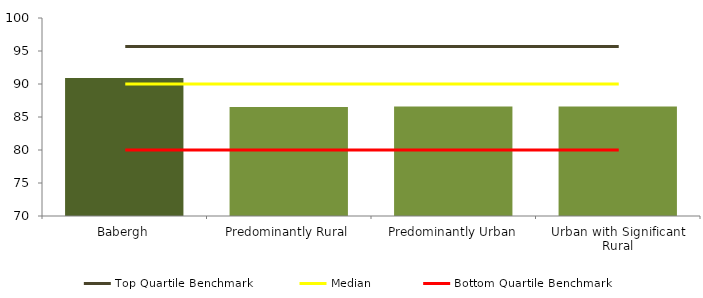
| Category | Series 0 |
|---|---|
| Babergh | 90.909 |
| Predominantly Rural | 86.498 |
| Predominantly Urban | 86.61 |
| Urban with Significant Rural | 86.577 |